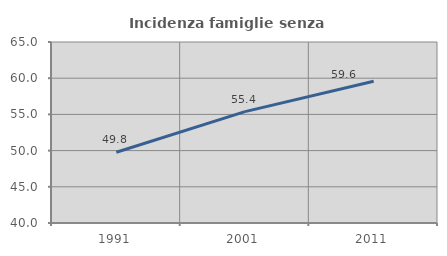
| Category | Incidenza famiglie senza nuclei |
|---|---|
| 1991.0 | 49.774 |
| 2001.0 | 55.385 |
| 2011.0 | 59.585 |